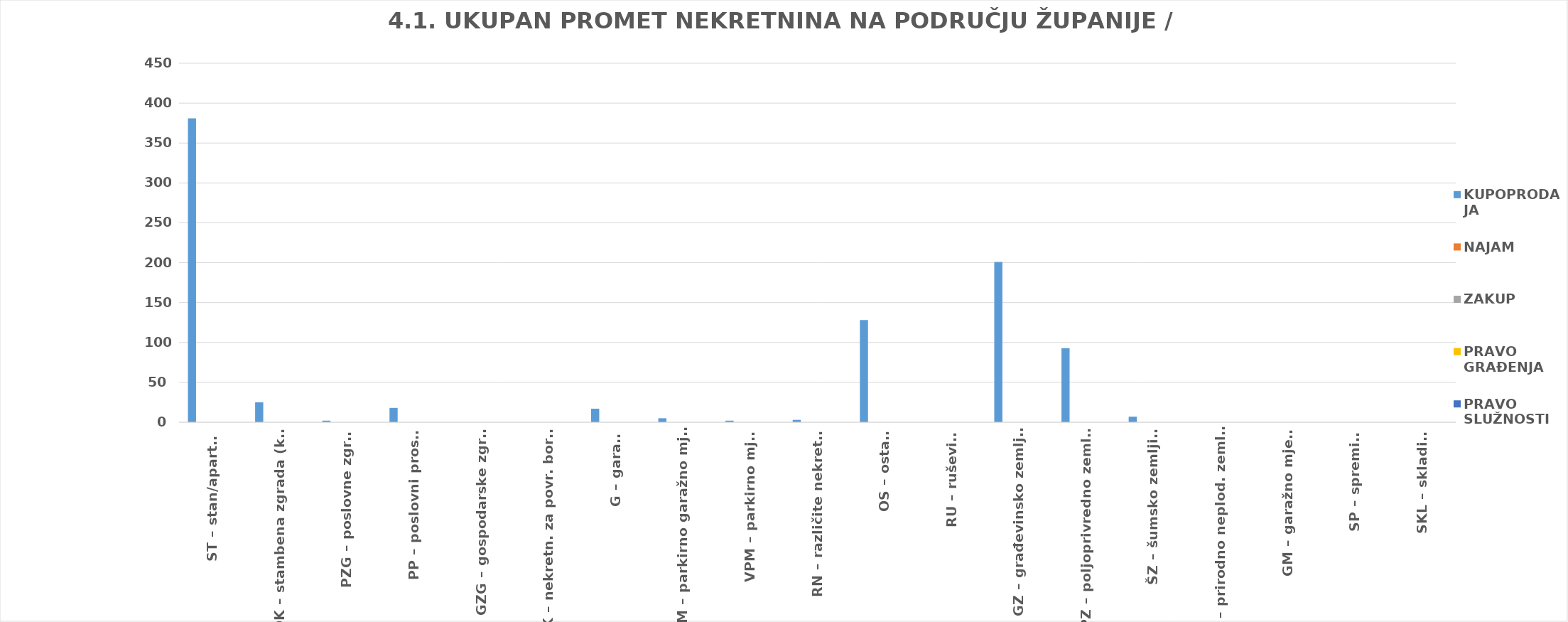
| Category | KUPOPRODAJA | NAJAM | ZAKUP | PRAVO GRAĐENJA | PRAVO SLUŽNOSTI |
|---|---|---|---|---|---|
| ST – stan/apartman | 381 | 0 | 0 | 0 | 0 |
| OK – stambena zgrada (kuća) | 25 | 0 | 0 | 0 | 0 |
| PZG – poslovne zgrade | 2 | 0 | 0 | 0 | 0 |
| PP – poslovni prostori | 18 | 0 | 0 | 0 | 0 |
| GZG – gospodarske zgrade | 0 | 0 | 0 | 0 | 0 |
| VIK – nekretn. za povr. boravak | 0 | 0 | 0 | 0 | 0 |
| G – garaža | 17 | 0 | 0 | 0 | 0 |
| PGM – parkirno garažno mjesto | 5 | 0 | 0 | 0 | 0 |
| VPM – parkirno mjesto | 2 | 0 | 0 | 0 | 0 |
| RN – različite nekretnine | 3 | 0 | 0 | 0 | 0 |
| OS – ostalo | 128 | 0 | 0 | 0 | 0 |
| RU – ruševine | 0 | 0 | 0 | 0 | 0 |
| GZ – građevinsko zemljište | 201 | 0 | 0 | 0 | 0 |
| PZ – poljoprivredno zemljište | 93 | 0 | 0 | 0 | 0 |
| ŠZ – šumsko zemljište | 7 | 0 | 0 | 0 | 0 |
| PNZ – prirodno neplod. zemljište | 0 | 0 | 0 | 0 | 0 |
| GM – garažno mjesto | 0 | 0 | 0 | 0 | 0 |
| SP – spremište | 0 | 0 | 0 | 0 | 0 |
| SKL – skladište | 0 | 0 | 0 | 0 | 0 |